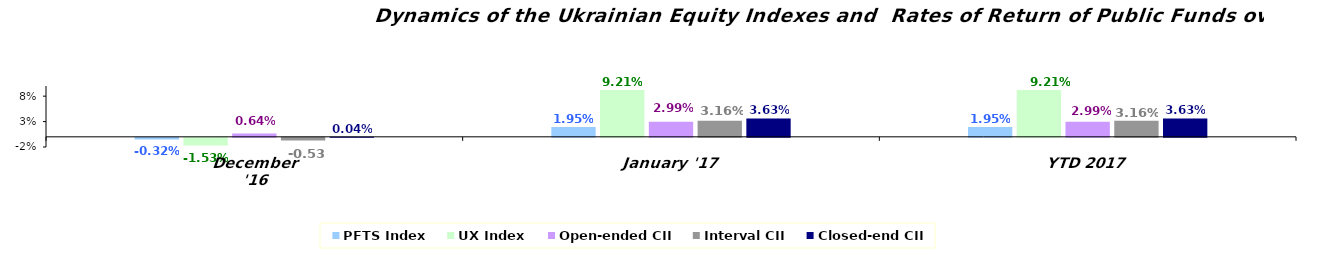
| Category | PFTS Index | UX Index | Open-ended CII | Interval CII | Closed-end CII |
|---|---|---|---|---|---|
| December '16 | -0.003 | -0.015 | 0.006 | -0.005 | 0 |
| January '17 | 0.019 | 0.092 | 0.03 | 0.032 | 0.036 |
| YTD 2017 | 0.019 | 0.092 | 0.03 | 0.032 | 0.036 |